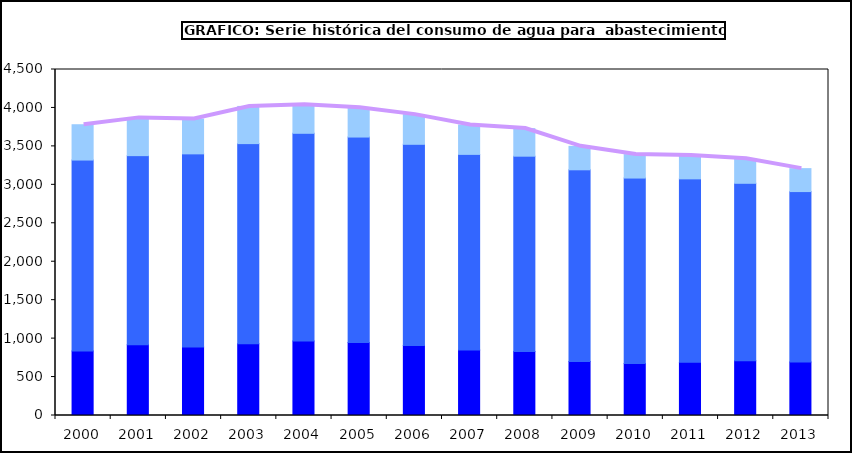
| Category | Sectores económicos  | Hogares  | Consumos municipales y otros |
|---|---|---|---|
| 2000.0 | 840.165 | 2482.085 | 459.43 |
| 2001.0 | 920.127 | 2459.548 | 490.975 |
| 2002.0 | 891.039 | 2511.81 | 452.848 |
| 2003.0 | 933.309 | 2602.904 | 483.402 |
| 2004.0 | 969.34 | 2700.928 | 372.131 |
| 2005.0 | 947.955 | 2673.564 | 380.661 |
| 2006.0 | 911.264 | 2615.751 | 386.044 |
| 2007.0 | 852.276 | 2543.714 | 382.046 |
| 2008.0 | 832.701 | 2539.891 | 358.807 |
| 2009.0 | 701.655 | 2493.842 | 305.081 |
| 2010.0 | 675.454 | 2412.708 | 305.109 |
| 2011.0 | 693.42 | 2384.386 | 303.512 |
| 2012.0 | 711.17 | 2308.872 | 317.986 |
| 2013.0 | 694.659 | 2217.686 | 298.498 |